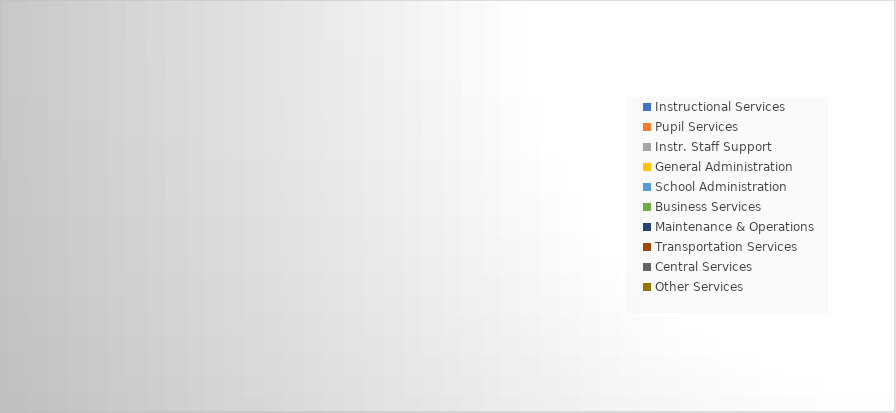
| Category | Series 0 |
|---|---|
| Instructional Services | 0 |
| Pupil Services | 0 |
| Instr. Staff Support | 0 |
| General Administration | 0 |
| School Administration | 0 |
| Business Services | 0 |
| Maintenance & Operations | 0 |
| Transportation Services | 0 |
| Central Services | 0 |
| Other Services | 0 |